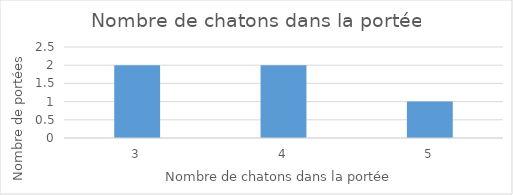
| Category | Series 0 |
|---|---|
| 3.0 | 2 |
| 4.0 | 2 |
| 5.0 | 1 |